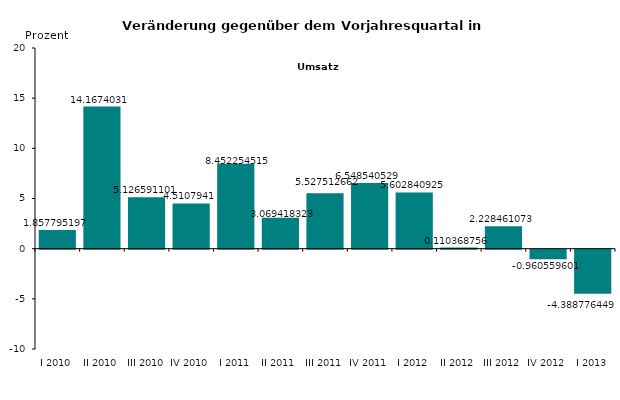
| Category | Series 0 |
|---|---|
| I 2010 | 1.858 |
| II 2010 | 14.167 |
| III 2010 | 5.127 |
| IV 2010 | 4.511 |
| I 2011 | 8.452 |
| II 2011 | 3.069 |
| III 2011 | 5.528 |
| IV 2011 | 6.549 |
| I 2012 | 5.603 |
| II 2012 | 0.11 |
| III 2012 | 2.228 |
| IV 2012 | -0.961 |
| I 2013 | -4.389 |